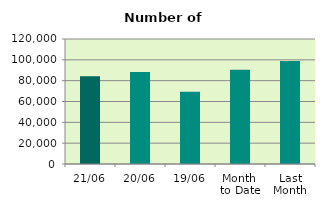
| Category | Series 0 |
|---|---|
| 21/06 | 84178 |
| 20/06 | 88388 |
| 19/06 | 69420 |
| Month 
to Date | 90434.8 |
| Last
Month | 98885.545 |